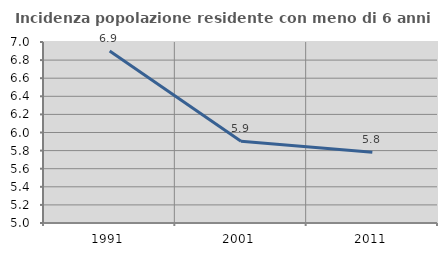
| Category | Incidenza popolazione residente con meno di 6 anni |
|---|---|
| 1991.0 | 6.901 |
| 2001.0 | 5.904 |
| 2011.0 | 5.781 |